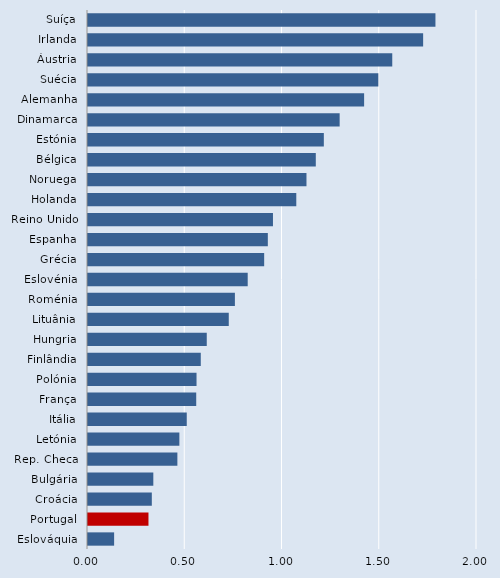
| Category | Series 0 |
|---|---|
| Suíça | 1.786 |
| Irlanda | 1.723 |
| Áustria | 1.564 |
| Suécia | 1.493 |
| Alemanha | 1.42 |
| Dinamarca | 1.294 |
| Estónia | 1.213 |
| Bélgica | 1.171 |
| Noruega | 1.123 |
| Holanda | 1.071 |
| Reino Unido | 0.951 |
| Espanha | 0.925 |
| Grécia | 0.906 |
| Eslovénia | 0.821 |
| Roménia | 0.755 |
| Lituânia | 0.724 |
| Hungria | 0.611 |
| Finlândia | 0.58 |
| Polónia | 0.558 |
| França | 0.556 |
| Itália | 0.508 |
| Letónia | 0.47 |
| Rep. Checa | 0.46 |
| Bulgária | 0.336 |
| Croácia | 0.328 |
| Portugal | 0.311 |
| Eslováquia | 0.134 |